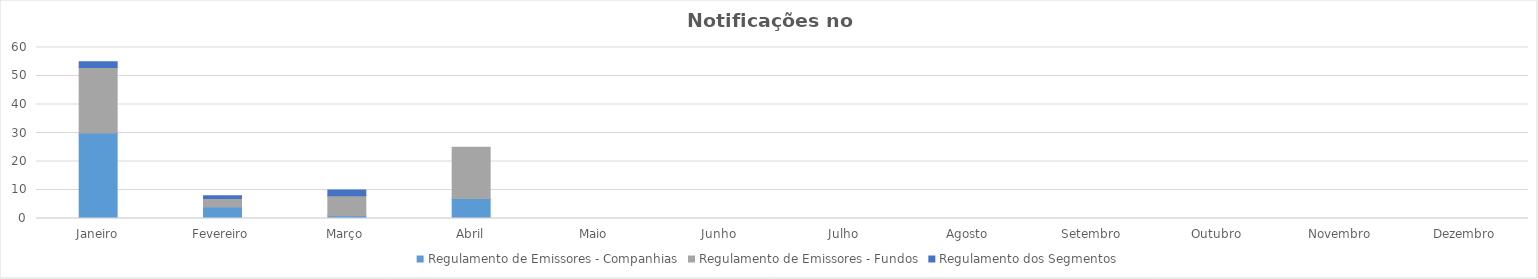
| Category | Regulamento de Emissores - Companhias | Regulamento de Emissores - Fundos | Regulamento dos Segmentos |
|---|---|---|---|
| Janeiro | 30 | 23 | 2 |
| Fevereiro | 4 | 3 | 1 |
| Março | 1 | 7 | 2 |
| Abril | 7 | 18 | 0 |
| Maio | 0 | 0 | 0 |
| Junho | 0 | 0 | 0 |
| Julho | 0 | 0 | 0 |
| Agosto | 0 | 0 | 0 |
| Setembro | 0 | 0 | 0 |
| Outubro | 0 | 0 | 0 |
| Novembro | 0 | 0 | 0 |
| Dezembro | 0 | 0 | 0 |